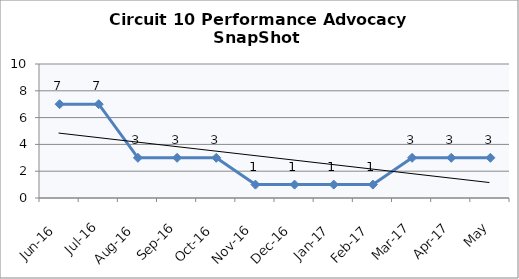
| Category | Circuit 10 |
|---|---|
| Jun-16 | 7 |
| Jul-16 | 7 |
| Aug-16 | 3 |
| Sep-16 | 3 |
| Oct-16 | 3 |
| Nov-16 | 1 |
| Dec-16 | 1 |
| Jan-17 | 1 |
| Feb-17 | 1 |
| Mar-17 | 3 |
| Apr-17 | 3 |
| May | 3 |